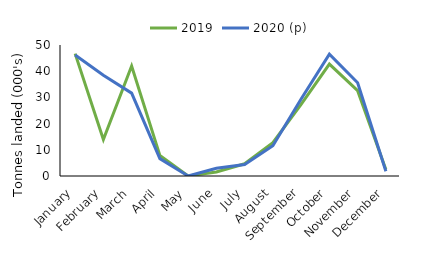
| Category | 2019 | 2020 (p) |
|---|---|---|
| January | 46.702 | 46.162 |
| February | 13.905 | 38.467 |
| March | 41.957 | 31.633 |
| April | 7.886 | 6.625 |
| May | 0.009 | 0.016 |
| June | 1.557 | 2.953 |
| July | 4.655 | 4.364 |
| August | 12.699 | 11.583 |
| September | 27.345 | 29.41 |
| October | 42.73 | 46.481 |
| November | 32.561 | 35.591 |
| December | 2.453 | 1.812 |